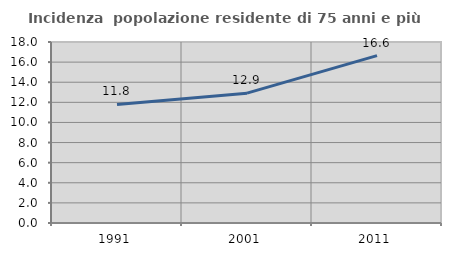
| Category | Incidenza  popolazione residente di 75 anni e più |
|---|---|
| 1991.0 | 11.79 |
| 2001.0 | 12.911 |
| 2011.0 | 16.644 |